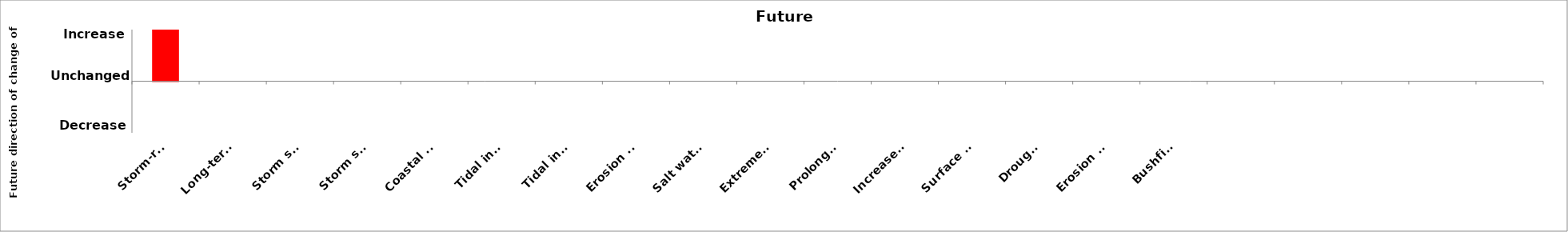
| Category | Future Direction |
|---|---|
| Storm-related beach erosion (short-term erosion) | 1 |
| Long-term shoreline recession around open coast beaches | 0 |
| Storm surge inundation of beach and surrounding areas | 0 |
| Storm surge inundation of estuaries and surrounding areas | 0 |
| Coastal lake or watercourse entrance instability | 0 |
| Tidal inundation of beach and surrounding areas | 0 |
| Tidal inundation of estuaries and surrounding area | 0 |
| Erosion within estuaries | 0 |
| Salt water intrusion to groundwater | 0 |
| Extreme winds from cyclones and coastal lows | 0 |
| Prolonged summer heatwaves | 0 |
| Increased number of hot days and nights | 0 |
| Surface water flooding (including sewer flooding) | 0 |
| Drought | 0 |
| Erosion induced by excessive rainfall | 0 |
| Bushfire | 0 |